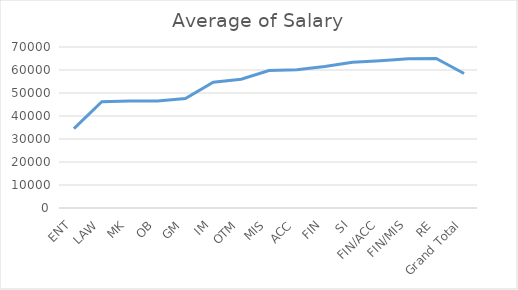
| Category | Average of Salary |
|---|---|
| ENT | 34500 |
| LAW | 46187.5 |
| MK | 46541.463 |
| OB | 46566.667 |
| GM | 47583.333 |
| IM | 54681.818 |
| OTM | 55979.231 |
| MIS | 59750 |
| ACC | 60130.435 |
| FIN | 61497.538 |
| SI | 63333.333 |
| FIN/ACC | 63978.723 |
| FIN/MIS | 64838.16 |
| RE | 65000 |
| Grand Total | 58482.031 |